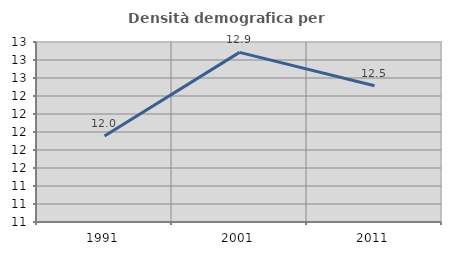
| Category | Densità demografica |
|---|---|
| 1991.0 | 11.956 |
| 2001.0 | 12.885 |
| 2011.0 | 12.513 |